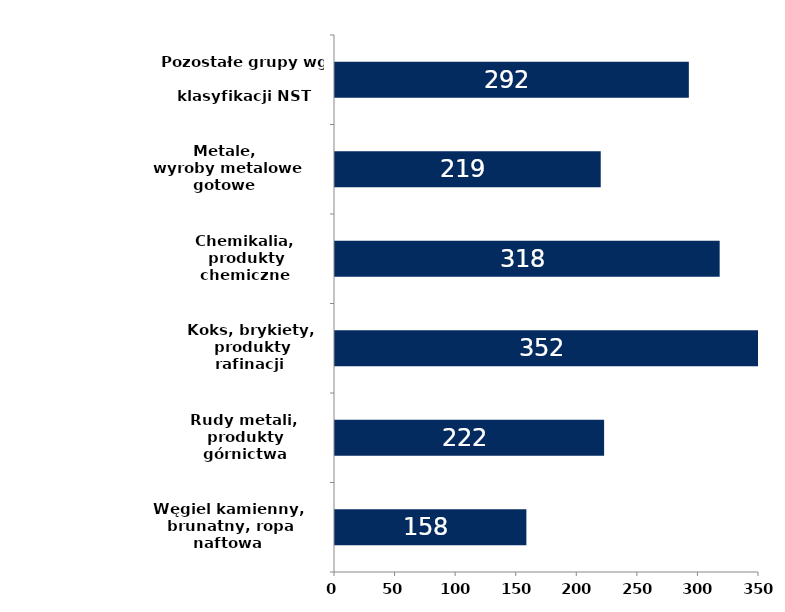
| Category | I kwartał |
|---|---|
| Węgiel kamienny,
 brunatny, ropa naftowa
 i gaz ziemny | 157.977 |
| Rudy metali, 
produkty górnictwa
 i kopalnictwa | 222.14 |
| Koks, brykiety,
 produkty rafinacji
 ropy naftowej | 351.994 |
| Chemikalia,
 produkty chemiczne | 317.539 |
| Metale,
 wyroby metalowe gotowe | 219.35 |
| Pozostałe grupy wg 
klasyfikacji NST | 292.084 |